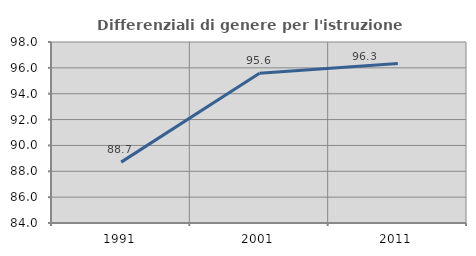
| Category | Differenziali di genere per l'istruzione superiore |
|---|---|
| 1991.0 | 88.708 |
| 2001.0 | 95.59 |
| 2011.0 | 96.344 |